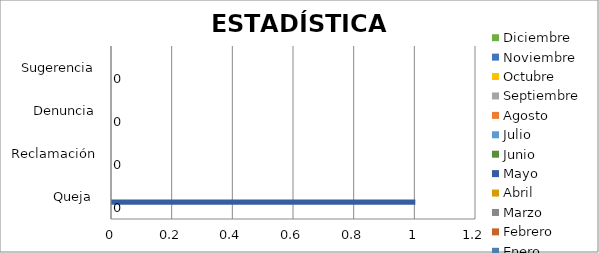
| Category | Enero | Febrero | Marzo | Abril | Mayo | Junio | Julio | Agosto | Septiembre | Octubre | Noviembre | Diciembre |
|---|---|---|---|---|---|---|---|---|---|---|---|---|
| Queja  | 0 | 0 | 0 | 0 | 1 | 0 | 0 | 0 | 0 |  |  |  |
| Reclamación | 0 | 0 | 0 | 0 | 0 | 0 | 0 | 0 | 0 |  |  |  |
| Denuncia | 0 | 0 | 0 | 0 | 0 | 0 | 0 | 0 | 0 |  |  |  |
| Sugerencia | 0 | 0 | 0 | 0 | 0 | 0 | 0 | 0 | 0 |  |  |  |